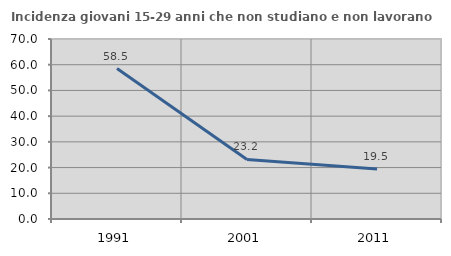
| Category | Incidenza giovani 15-29 anni che non studiano e non lavorano  |
|---|---|
| 1991.0 | 58.488 |
| 2001.0 | 23.158 |
| 2011.0 | 19.474 |